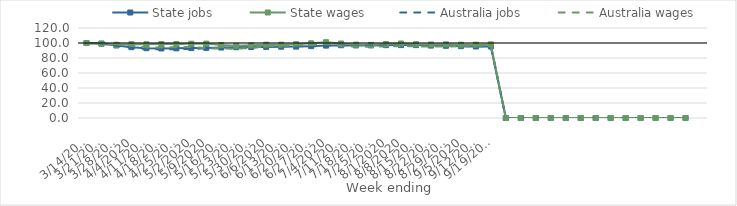
| Category | State jobs | State wages | Australia jobs | Australia wages |
|---|---|---|---|---|
| 14/03/2020 | 100 | 100 | 100 | 100 |
| 21/03/2020 | 99.312 | 98.784 | 99.278 | 99.672 |
| 28/03/2020 | 96.709 | 97.661 | 96.309 | 98.416 |
| 04/04/2020 | 94.436 | 98.336 | 93.652 | 96.688 |
| 11/04/2020 | 93.071 | 98.307 | 91.928 | 94.131 |
| 18/04/2020 | 92.698 | 98.575 | 91.47 | 94.024 |
| 25/04/2020 | 92.873 | 98.565 | 91.802 | 94.259 |
| 02/05/2020 | 93.206 | 99.047 | 92.199 | 94.709 |
| 09/05/2020 | 93.457 | 99.194 | 92.746 | 93.35 |
| 16/05/2020 | 93.923 | 97.24 | 93.278 | 92.689 |
| 23/05/2020 | 94.411 | 96.328 | 93.582 | 92.309 |
| 30/05/2020 | 94.615 | 96.864 | 94.088 | 93.584 |
| 06/06/2020 | 94.826 | 97.759 | 95.005 | 95.392 |
| 13/06/2020 | 95.063 | 97.751 | 95.464 | 96.09 |
| 20/06/2020 | 95.207 | 98.381 | 95.655 | 97.004 |
| 27/06/2020 | 95.82 | 99.642 | 95.595 | 97.247 |
| 04/07/2020 | 96.539 | 101.066 | 96.297 | 98.874 |
| 11/07/2020 | 97.056 | 99.343 | 96.584 | 95.79 |
| 18/07/2020 | 96.753 | 97.828 | 96.449 | 95.216 |
| 25/07/2020 | 96.765 | 97.519 | 96.501 | 94.86 |
| 01/08/2020 | 97.145 | 98.635 | 96.569 | 95.541 |
| 08/08/2020 | 97.169 | 99.388 | 96.344 | 95.915 |
| 15/08/2020 | 97.169 | 98.37 | 96.168 | 95.478 |
| 22/08/2020 | 96.552 | 98.007 | 96.063 | 95.259 |
| 29/08/2020 | 96.255 | 98.2 | 95.951 | 95.312 |
| 05/09/2020 | 95.817 | 97.794 | 95.576 | 96.393 |
| 12/09/2020 | 95.368 | 97.753 | 95.53 | 96.207 |
| 19/09/2020 | 95.369 | 98.143 | 95.881 | 97.123 |